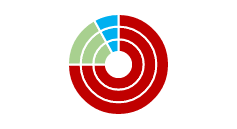
| Category | Work |
|---|---|
| Frequent | 0.75 |
| Moderate | 0.17 |
| Infrequent | 0.08 |